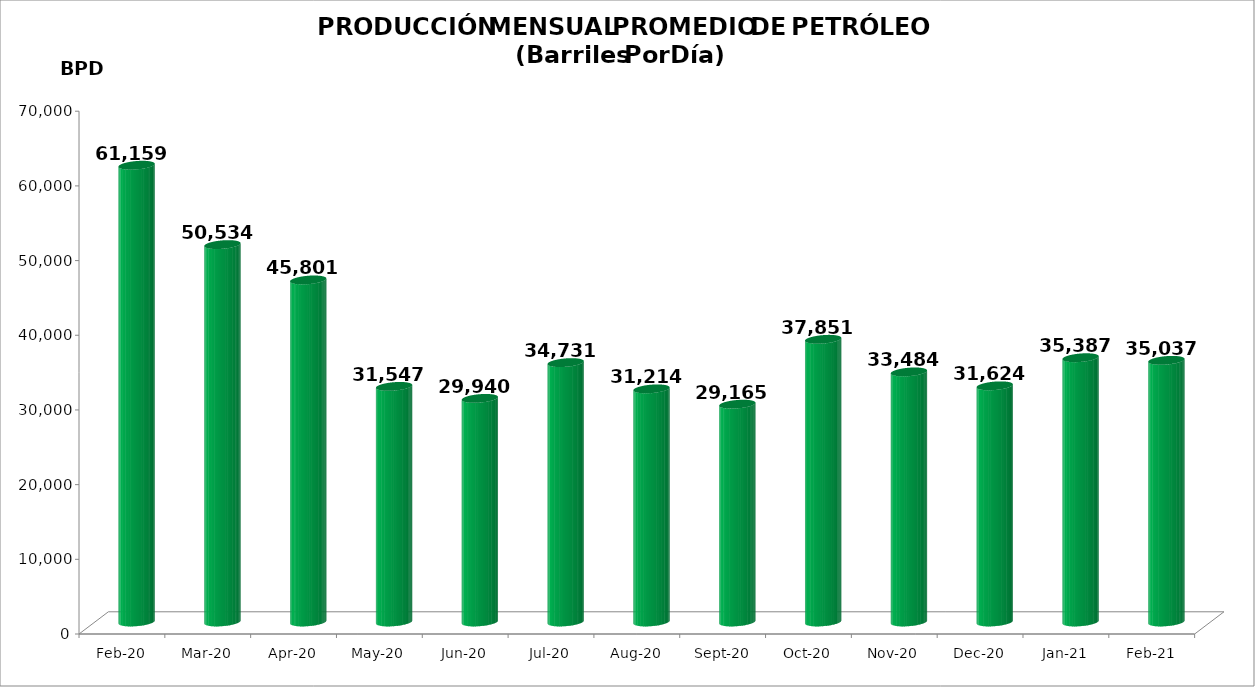
| Category | Series 0 |
|---|---|
| 2020-02-01 | 61159 |
| 2020-03-01 | 50534 |
| 2020-04-01 | 45801 |
| 2020-05-01 | 31547 |
| 2020-06-01 | 29940 |
| 2020-07-01 | 34731 |
| 2020-08-01 | 31214 |
| 2020-09-01 | 29165 |
| 2020-10-01 | 37851 |
| 2020-11-01 | 33484 |
| 2020-12-01 | 31624 |
| 2021-01-01 | 35387 |
| 2021-02-01 | 35037 |